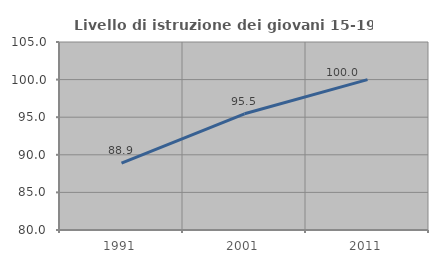
| Category | Livello di istruzione dei giovani 15-19 anni |
|---|---|
| 1991.0 | 88.889 |
| 2001.0 | 95.455 |
| 2011.0 | 100 |